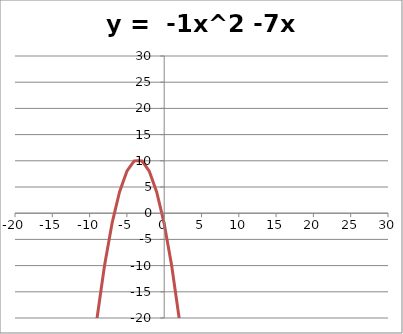
| Category | y =  -1x^2 -7x -2 |
|---|---|
| -25.0 | -452 |
| -24.0 | -410 |
| -23.0 | -370 |
| -22.0 | -332 |
| -21.0 | -296 |
| -20.0 | -262 |
| -19.0 | -230 |
| -18.0 | -200 |
| -17.0 | -172 |
| -16.0 | -146 |
| -15.0 | -122 |
| -14.0 | -100 |
| -13.0 | -80 |
| -12.0 | -62 |
| -11.0 | -46 |
| -10.0 | -32 |
| -9.0 | -20 |
| -8.0 | -10 |
| -7.0 | -2 |
| -6.0 | 4 |
| -5.0 | 8 |
| -4.0 | 10 |
| -3.0 | 10 |
| -2.0 | 8 |
| -1.0 | 4 |
| 0.0 | -2 |
| 1.0 | -10 |
| 2.0 | -20 |
| 3.0 | -32 |
| 4.0 | -46 |
| 5.0 | -62 |
| 6.0 | -80 |
| 7.0 | -100 |
| 8.0 | -122 |
| 9.0 | -146 |
| 10.0 | -172 |
| 11.0 | -200 |
| 12.0 | -230 |
| 13.0 | -262 |
| 14.0 | -296 |
| 15.0 | -332 |
| 16.0 | -370 |
| 17.0 | -410 |
| 18.0 | -452 |
| 19.0 | -496 |
| 20.0 | -542 |
| 21.0 | -590 |
| 22.0 | -640 |
| 23.0 | -692 |
| 24.0 | -746 |
| 25.0 | -802 |
| 26.0 | -860 |
| 27.0 | -920 |
| 28.0 | -982 |
| 29.0 | -1046 |
| 30.0 | -1112 |
| 31.0 | -1180 |
| 32.0 | -1250 |
| 33.0 | -1322 |
| 34.0 | -1396 |
| 35.0 | -1472 |
| 36.0 | -1550 |
| 37.0 | -1630 |
| 38.0 | -1712 |
| 39.0 | -1796 |
| 40.0 | -1882 |
| 41.0 | -1970 |
| 42.0 | -2060 |
| 43.0 | -2152 |
| 44.0 | -2246 |
| 45.0 | -2342 |
| 46.0 | -2440 |
| 47.0 | -2540 |
| 48.0 | -2642 |
| 49.0 | -2746 |
| 50.0 | -2852 |
| 51.0 | -2960 |
| 52.0 | -3070 |
| 53.0 | -3182 |
| 54.0 | -3296 |
| 55.0 | -3412 |
| 56.0 | -3530 |
| 57.0 | -3650 |
| 58.0 | -3772 |
| 59.0 | -3896 |
| 60.0 | -4022 |
| 61.0 | -4150 |
| 62.0 | -4280 |
| 63.0 | -4412 |
| 64.0 | -4546 |
| 65.0 | -4682 |
| 66.0 | -4820 |
| 67.0 | -4960 |
| 68.0 | -5102 |
| 69.0 | -5246 |
| 70.0 | -5392 |
| 71.0 | -5540 |
| 72.0 | -5690 |
| 73.0 | -5842 |
| 74.0 | -5996 |
| 75.0 | -6152 |